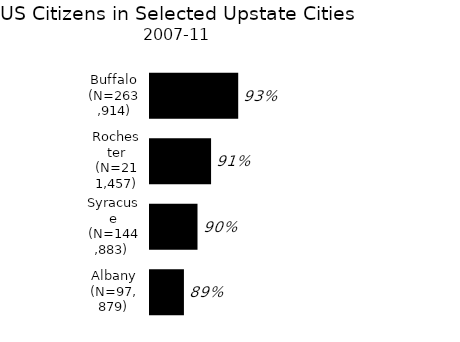
| Category | Series 0 |
|---|---|
| Albany (N=97,879) | 0.89 |
| Syracuse (N=144,883)  | 0.9 |
| Rochester (N=211,457) | 0.91 |
| Buffalo (N=263,914) | 0.93 |